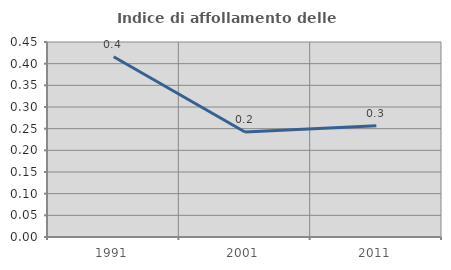
| Category | Indice di affollamento delle abitazioni  |
|---|---|
| 1991.0 | 0.416 |
| 2001.0 | 0.242 |
| 2011.0 | 0.257 |